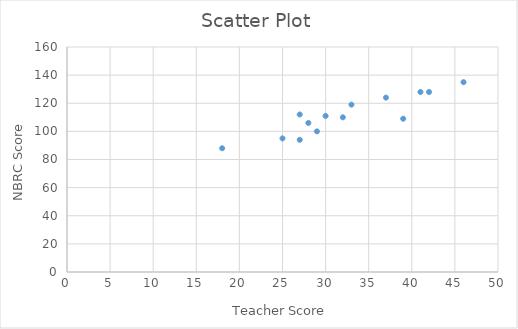
| Category | NBRC Score |
|---|---|
| 37.0 | 124 |
| 18.0 | 88 |
| 46.0 | 135 |
| 27.0 | 112 |
| 39.0 | 109 |
| 29.0 | 100 |
| 27.0 | 94 |
| 28.0 | 106 |
| 32.0 | 110 |
| 41.0 | 128 |
| 33.0 | 119 |
| 25.0 | 95 |
| 30.0 | 111 |
| 42.0 | 128 |